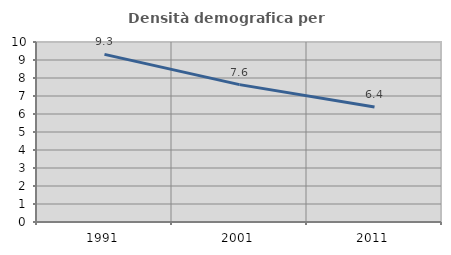
| Category | Densità demografica |
|---|---|
| 1991.0 | 9.313 |
| 2001.0 | 7.631 |
| 2011.0 | 6.386 |